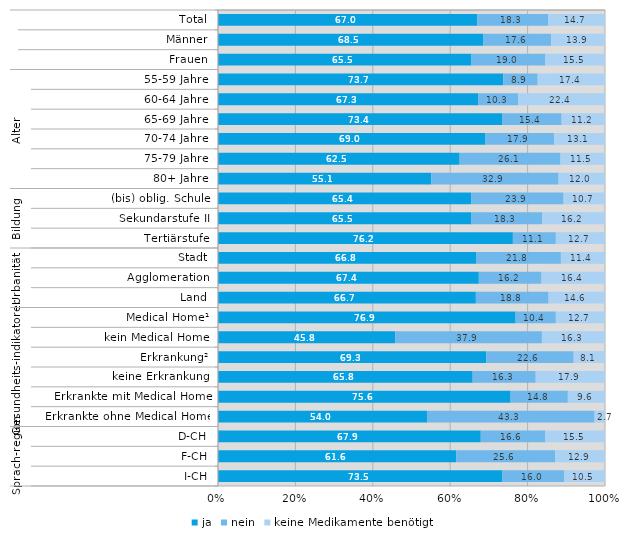
| Category | ja | nein | keine Medikamente benötigt |
|---|---|---|---|
| 0 | 67 | 18.3 | 14.7 |
| 1 | 68.5 | 17.6 | 13.9 |
| 2 | 65.5 | 19 | 15.5 |
| 3 | 73.7 | 8.9 | 17.4 |
| 4 | 67.3 | 10.3 | 22.4 |
| 5 | 73.4 | 15.4 | 11.2 |
| 6 | 69 | 17.9 | 13.1 |
| 7 | 62.5 | 26.1 | 11.5 |
| 8 | 55.1 | 32.9 | 12 |
| 9 | 65.4 | 23.9 | 10.7 |
| 10 | 65.5 | 18.3 | 16.2 |
| 11 | 76.2 | 11.1 | 12.7 |
| 12 | 66.8 | 21.8 | 11.4 |
| 13 | 67.4 | 16.2 | 16.4 |
| 14 | 66.7 | 18.8 | 14.6 |
| 15 | 76.9 | 10.4 | 12.7 |
| 16 | 45.8 | 37.9 | 16.3 |
| 17 | 69.3 | 22.6 | 8.1 |
| 18 | 65.8 | 16.3 | 17.9 |
| 19 | 75.6 | 14.8 | 9.6 |
| 20 | 54 | 43.3 | 2.7 |
| 21 | 67.9 | 16.6 | 15.5 |
| 22 | 61.6 | 25.6 | 12.9 |
| 23 | 73.5 | 16 | 10.5 |